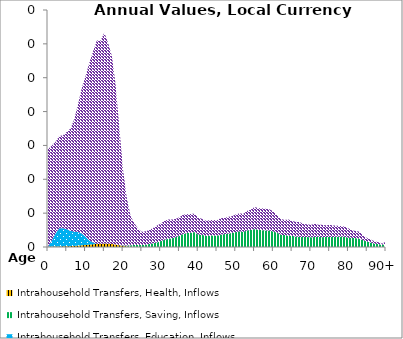
| Category | Intrahousehold Transfers, Health, Inflows | Intrahousehold Transfers, Saving, Inflows | Intrahousehold Transfers, Education, Inflows | Intrahousehold Transfers, Consumption other than health and education, Inflows |
|---|---|---|---|---|
| 0 | 0.021 | 0 | 0 | 5.761 |
|  | 0.027 | 0 | 0.347 | 5.609 |
| 2 | 0.031 | 0 | 0.777 | 5.401 |
| 3 | 0.035 | 0 | 1.078 | 5.448 |
| 4 | 0.038 | 0 | 1.071 | 5.485 |
| 5 | 0.044 | 0 | 1.007 | 5.743 |
| 6 | 0.052 | 0 | 0.911 | 6.048 |
| 7 | 0.065 | 0 | 0.834 | 6.651 |
| 8 | 0.082 | 0 | 0.812 | 7.541 |
| 9 | 0.102 | 0 | 0.686 | 8.608 |
| 10 | 0.121 | 0 | 0.49 | 9.48 |
| 11 | 0.142 | 0 | 0.247 | 10.493 |
| 12 | 0.162 | 0 | 0.104 | 11.29 |
| 13 | 0.181 | 0 | 0.004 | 12.012 |
| 14 | 0.188 | 0 | 0.002 | 12.002 |
| 15 | 0.201 | 0 | 0.004 | 12.46 |
| 16 | 0.193 | 0.001 | 0 | 11.864 |
| 17 | 0.179 | 0.001 | 0 | 11.109 |
| 18 | 0.147 | 0.002 | 0 | 9.44 |
| 19 | 0.101 | 0.006 | 0.001 | 6.906 |
| 20 | 0.06 | 0.027 | 0.001 | 4.441 |
| 21 | 0.032 | 0.055 | 0.001 | 2.776 |
| 22 | 0.015 | 0.092 | 0 | 1.718 |
| 23 | 0.008 | 0.107 | 0 | 1.288 |
| 24 | 0.002 | 0.123 | 0 | 0.947 |
| 25 | 0 | 0.119 | 0 | 0.776 |
| 26 | 0 | 0.133 | 0 | 0.797 |
| 27 | 0 | 0.179 | 0 | 0.826 |
| 28 | 0 | 0.219 | 0 | 0.906 |
| 29 | 0 | 0.267 | 0 | 0.998 |
| 30 | 0 | 0.344 | 0 | 1.034 |
| 31 | 0 | 0.424 | 0 | 1.122 |
| 32 | 0 | 0.485 | 0 | 1.138 |
| 33 | 0 | 0.519 | 0 | 1.098 |
| 34 | 0 | 0.579 | 0 | 1.084 |
| 35 | 0 | 0.656 | 0 | 1.1 |
| 36 | 0 | 0.774 | 0 | 1.142 |
| 37 | 0 | 0.819 | 0 | 1.121 |
| 38 | 0 | 0.84 | 0 | 1.115 |
| 39 | 0 | 0.881 | 0 | 1.079 |
| 40 | 0 | 0.738 | 0 | 0.993 |
| 41 | 0 | 0.723 | 0 | 0.939 |
| 42 | 0 | 0.663 | 0 | 0.896 |
| 43 | 0 | 0.669 | 0 | 0.909 |
| 44 | 0 | 0.677 | 0 | 0.921 |
| 45 | 0 | 0.668 | 0 | 0.91 |
| 46 | 0 | 0.729 | 0 | 0.971 |
| 47 | 0 | 0.763 | 0 | 0.955 |
| 48 | 0 | 0.789 | 0 | 0.992 |
| 49 | 0 | 0.826 | 0 | 0.996 |
| 50 | 0 | 0.881 | 0 | 1.044 |
| 51 | 0 | 0.929 | 0 | 1.057 |
| 52 | 0 | 0.892 | 0 | 1.064 |
| 53 | 0 | 0.984 | 0 | 1.149 |
| 54 | 0 | 1.002 | 0 | 1.207 |
| 55 | 0 | 1.059 | 0 | 1.3 |
| 56 | 0 | 1.018 | 0 | 1.282 |
| 57 | 0 | 0.996 | 0 | 1.29 |
| 58 | 0 | 0.977 | 0 | 1.278 |
| 59 | 0 | 0.968 | 0 | 1.254 |
| 60 | 0 | 0.913 | 0 | 1.2 |
| 61 | 0 | 0.846 | 0 | 1.036 |
| 62 | 0 | 0.718 | 0 | 0.94 |
| 63 | 0 | 0.712 | 0 | 0.885 |
| 64 | 0 | 0.659 | 0 | 0.967 |
| 65 | 0 | 0.662 | 0 | 0.874 |
| 66 | 0 | 0.606 | 0 | 0.881 |
| 67 | 0 | 0.597 | 0 | 0.877 |
| 68 | 0 | 0.583 | 0 | 0.776 |
| 69 | 0 | 0.59 | 0 | 0.754 |
| 70 | 0 | 0.57 | 0 | 0.735 |
| 71 | 0 | 0.592 | 0 | 0.78 |
| 72 | 0 | 0.6 | 0 | 0.712 |
| 73 | 0 | 0.579 | 0 | 0.738 |
| 74 | 0 | 0.595 | 0 | 0.683 |
| 75 | 0 | 0.584 | 0 | 0.719 |
| 76 | 0 | 0.596 | 0 | 0.676 |
| 77 | 0 | 0.603 | 0 | 0.648 |
| 78 | 0 | 0.603 | 0 | 0.637 |
| 79 | 0 | 0.599 | 0 | 0.605 |
| 80 | 0 | 0.548 | 0 | 0.552 |
| 81 | 0 | 0.541 | 0 | 0.437 |
| 82 | 0 | 0.52 | 0 | 0.428 |
| 83 | 0 | 0.487 | 0 | 0.41 |
| 84 | 0 | 0.395 | 0 | 0.266 |
| 85 | 0 | 0.318 | 0 | 0.206 |
| 86 | 0 | 0.255 | 0 | 0.176 |
| 87 | 0 | 0.197 | 0 | 0.137 |
| 88 | 0 | 0.17 | 0 | 0.112 |
| 89 | 0 | 0.132 | 0 | 0.069 |
| 90+ | 0 | 0.168 | 0 | 0.154 |